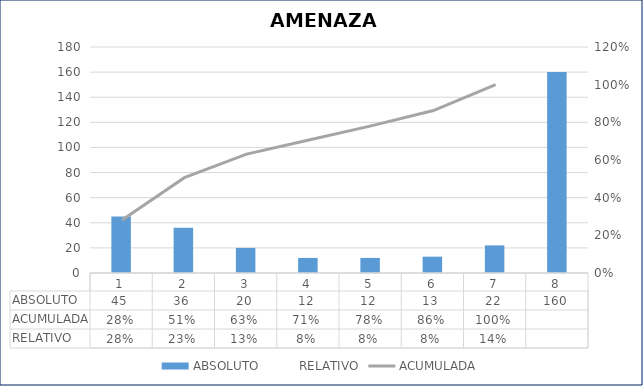
| Category | ABSOLUTO |
|---|---|
| 0 | 45 |
| 1 | 36 |
| 2 | 20 |
| 3 | 12 |
| 4 | 12 |
| 5 | 13 |
| 6 | 22 |
| 7 | 160 |